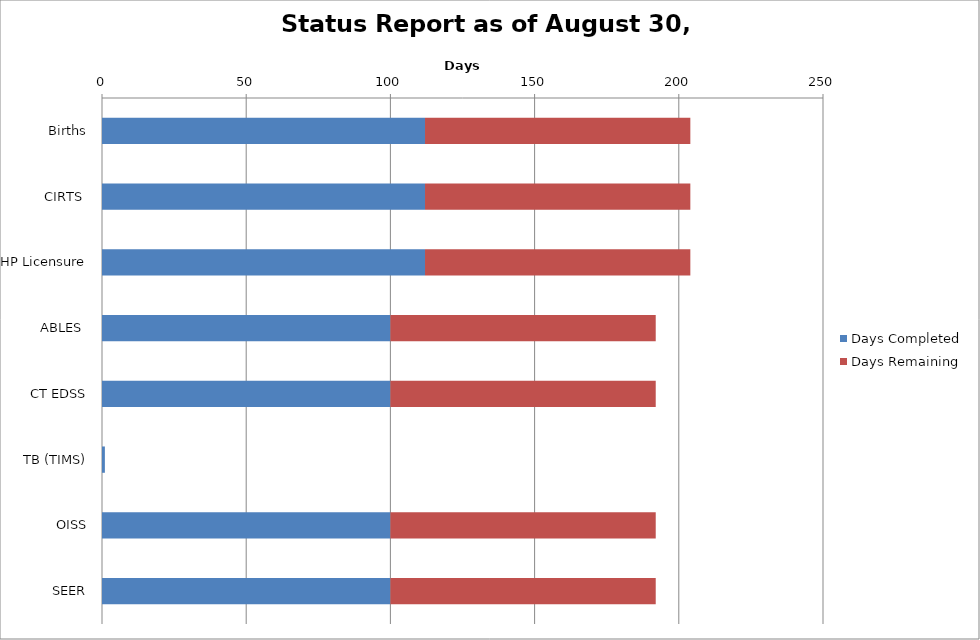
| Category | Days Completed | Days Remaining |
|---|---|---|
| Births | 112 | 92 |
| CIRTS  | 112 | 92 |
| HP Licensure | 112 | 92 |
| ABLES  | 100 | 92 |
| CT EDSS | 100 | 92 |
| TB (TIMS) | 1 | 0 |
| OISS | 100 | 92 |
| SEER | 100 | 92 |